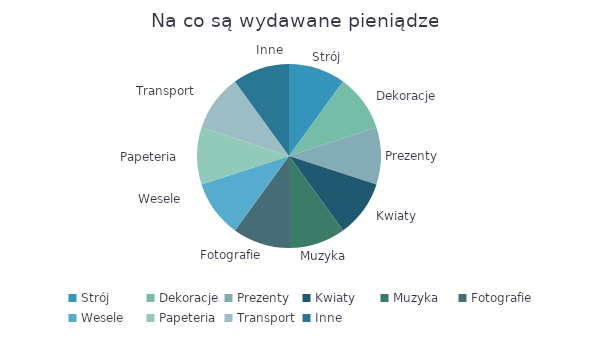
| Category | Kwota |
|---|---|
| Strój | 1 |
| Dekoracje | 1 |
| Prezenty | 1 |
| Kwiaty | 1 |
| Muzyka | 1 |
| Fotografie | 1 |
| Wesele | 1 |
| Papeteria | 1 |
| Transport | 1 |
| Inne | 1 |